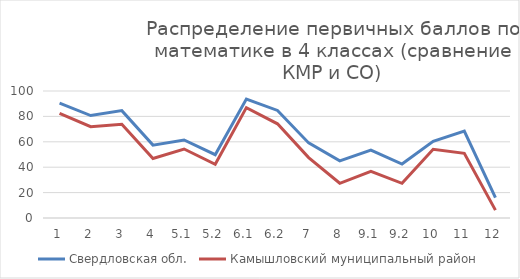
| Category | Свердловская обл. | Камышловский муниципальный район |
|---|---|---|
| 1.0 | 90.39 | 82.4 |
| 2.0 | 80.65 | 71.91 |
| 3.0 | 84.54 | 73.78 |
| 4.0 | 57.39 | 46.82 |
| 5.1 | 61.43 | 54.31 |
| 5.2 | 49.84 | 42.32 |
| 6.1 | 93.64 | 86.89 |
| 6.2 | 84.71 | 74.16 |
| 7.0 | 59.12 | 47.57 |
| 8.0 | 45 | 27.34 |
| 9.1 | 53.44 | 36.7 |
| 9.2 | 42.46 | 27.34 |
| 10.0 | 60.36 | 54.12 |
| 11.0 | 68.44 | 50.94 |
| 12.0 | 16.11 | 6.18 |